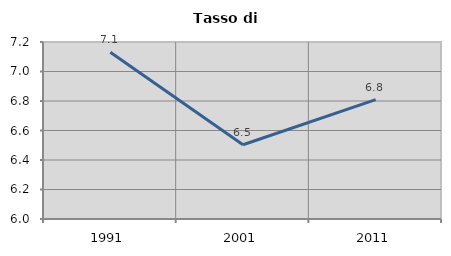
| Category | Tasso di disoccupazione   |
|---|---|
| 1991.0 | 7.131 |
| 2001.0 | 6.503 |
| 2011.0 | 6.809 |